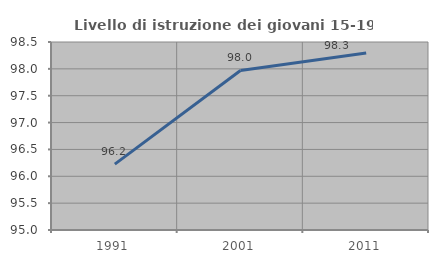
| Category | Livello di istruzione dei giovani 15-19 anni |
|---|---|
| 1991.0 | 96.226 |
| 2001.0 | 97.97 |
| 2011.0 | 98.295 |